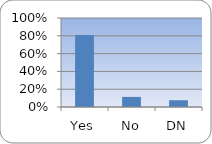
| Category | Series 0 |
|---|---|
| Yes | 0.81 |
| No | 0.114 |
| DN | 0.076 |